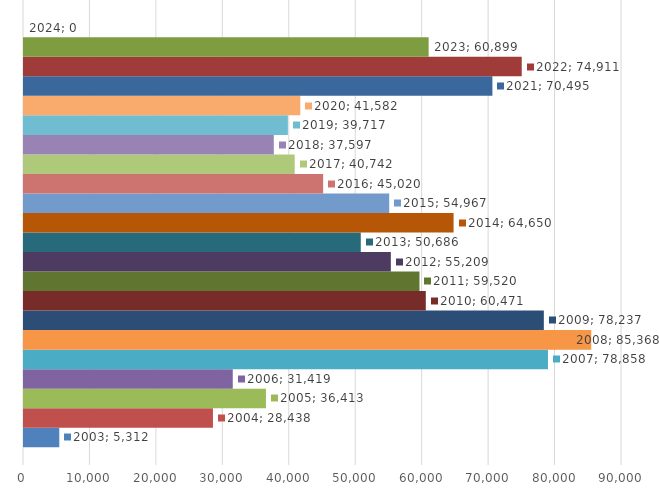
| Category | 2003 | 2004 | 2005 | 2006 | 2007 | 2008 | 2009 | 2010 | 2011 | 2012 | 2013 | 2014 | 2015 | 2016 | 2017 | 2018 | 2019 | 2020 | 2021 | 2022 | 2023 | 2024 |
|---|---|---|---|---|---|---|---|---|---|---|---|---|---|---|---|---|---|---|---|---|---|---|
| 0 | 5312 | 28438 | 36413 | 31419 | 78858 | 85368 | 78237 | 60471 | 59520 | 55209 | 50686 | 64650 | 54967 | 45020 | 40742 | 37597 | 39717 | 41582 | 70495 | 74911 | 60899 | 0 |